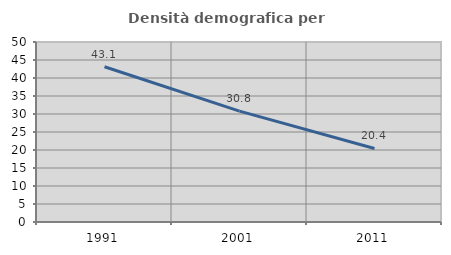
| Category | Densità demografica |
|---|---|
| 1991.0 | 43.115 |
| 2001.0 | 30.784 |
| 2011.0 | 20.428 |